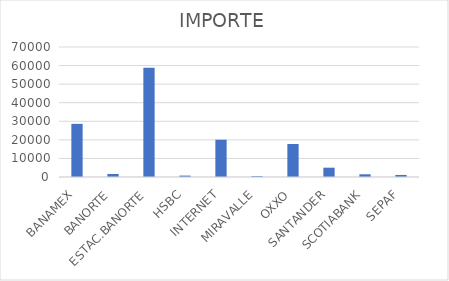
| Category | IMPORTE |
|---|---|
| BANAMEX | 28610.83 |
| BANORTE | 1632.49 |
| ESTAC.BANORTE | 58824 |
| HSBC | 754.04 |
| INTERNET | 20067.88 |
| MIRAVALLE | 466 |
| OXXO | 17769.24 |
| SANTANDER | 5014.72 |
| SCOTIABANK | 1456.51 |
| SEPAF | 1106.1 |